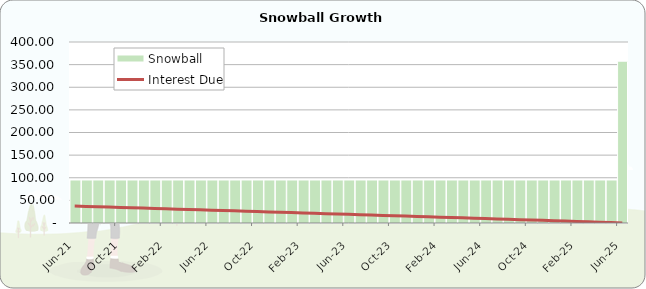
| Category | Snowball |
|---|---|
| 2021-06-01 | 95.03 |
| 2021-07-01 | 95.03 |
| 2021-08-01 | 95.03 |
| 2021-09-01 | 95.03 |
| 2021-10-01 | 95.03 |
| 2021-11-01 | 95.03 |
| 2021-12-01 | 95.03 |
| 2022-01-01 | 95.03 |
| 2022-02-01 | 95.03 |
| 2022-03-01 | 95.03 |
| 2022-04-01 | 95.03 |
| 2022-05-01 | 95.03 |
| 2022-06-01 | 95.03 |
| 2022-07-01 | 95.03 |
| 2022-08-01 | 95.03 |
| 2022-09-01 | 95.03 |
| 2022-10-01 | 95.03 |
| 2022-11-01 | 95.03 |
| 2022-12-01 | 95.03 |
| 2023-01-01 | 95.03 |
| 2023-02-01 | 95.03 |
| 2023-03-01 | 95.03 |
| 2023-04-01 | 95.03 |
| 2023-05-01 | 95.03 |
| 2023-06-01 | 95.03 |
| 2023-07-01 | 95.03 |
| 2023-08-01 | 95.03 |
| 2023-09-01 | 95.03 |
| 2023-10-01 | 95.03 |
| 2023-11-01 | 95.03 |
| 2023-12-01 | 95.03 |
| 2024-01-01 | 95.03 |
| 2024-02-01 | 95.03 |
| 2024-03-01 | 95.03 |
| 2024-04-01 | 95.03 |
| 2024-05-01 | 95.03 |
| 2024-06-01 | 95.03 |
| 2024-07-01 | 95.03 |
| 2024-08-01 | 95.03 |
| 2024-09-01 | 95.03 |
| 2024-10-01 | 95.03 |
| 2024-11-01 | 95.03 |
| 2024-12-01 | 95.03 |
| 2025-01-01 | 95.03 |
| 2025-02-01 | 95.03 |
| 2025-03-01 | 95.03 |
| 2025-04-01 | 95.03 |
| 2025-05-01 | 95.03 |
| 2025-06-01 | 357.56 |
| #N/A | 0 |
| #N/A | 0 |
| #N/A | 0 |
| #N/A | 0 |
| #N/A | 0 |
| #N/A | 0 |
| #N/A | 0 |
| #N/A | 0 |
| #N/A | 0 |
| #N/A | 0 |
| #N/A | 0 |
| #N/A | 0 |
| #N/A | 0 |
| #N/A | 0 |
| #N/A | 0 |
| #N/A | 0 |
| #N/A | 0 |
| #N/A | 0 |
| #N/A | 0 |
| #N/A | 0 |
| #N/A | 0 |
| #N/A | 0 |
| #N/A | 0 |
| #N/A | 0 |
| #N/A | 0 |
| #N/A | 0 |
| #N/A | 0 |
| #N/A | 0 |
| #N/A | 0 |
| #N/A | 0 |
| #N/A | 0 |
| #N/A | 0 |
| #N/A | 0 |
| #N/A | 0 |
| #N/A | 0 |
| #N/A | 0 |
| #N/A | 0 |
| #N/A | 0 |
| #N/A | 0 |
| #N/A | 0 |
| #N/A | 0 |
| #N/A | 0 |
| #N/A | 0 |
| #N/A | 0 |
| #N/A | 0 |
| #N/A | 0 |
| #N/A | 0 |
| #N/A | 0 |
| #N/A | 0 |
| #N/A | 0 |
| #N/A | 0 |
| #N/A | 0 |
| #N/A | 0 |
| #N/A | 0 |
| #N/A | 0 |
| #N/A | 0 |
| #N/A | 0 |
| #N/A | 0 |
| #N/A | 0 |
| #N/A | 0 |
| #N/A | 0 |
| #N/A | 0 |
| #N/A | 0 |
| #N/A | 0 |
| #N/A | 0 |
| #N/A | 0 |
| #N/A | 0 |
| #N/A | 0 |
| #N/A | 0 |
| #N/A | 0 |
| #N/A | 0 |
| #N/A | 0 |
| #N/A | 0 |
| #N/A | 0 |
| #N/A | 0 |
| #N/A | 0 |
| #N/A | 0 |
| #N/A | 0 |
| #N/A | 0 |
| #N/A | 0 |
| #N/A | 0 |
| #N/A | 0 |
| #N/A | 0 |
| #N/A | 0 |
| #N/A | 0 |
| #N/A | 0 |
| #N/A | 0 |
| #N/A | 0 |
| #N/A | 0 |
| #N/A | 0 |
| #N/A | 0 |
| #N/A | 0 |
| #N/A | 0 |
| #N/A | 0 |
| #N/A | 0 |
| #N/A | 0 |
| #N/A | 0 |
| #N/A | 0 |
| #N/A | 0 |
| #N/A | 0 |
| #N/A | 0 |
| #N/A | 0 |
| #N/A | 0 |
| #N/A | 0 |
| #N/A | 0 |
| #N/A | 0 |
| #N/A | 0 |
| #N/A | 0 |
| #N/A | 0 |
| #N/A | 0 |
| #N/A | 0 |
| #N/A | 0 |
| #N/A | 0 |
| #N/A | 0 |
| #N/A | 0 |
| #N/A | 0 |
| #N/A | 0 |
| #N/A | 0 |
| #N/A | 0 |
| #N/A | 0 |
| #N/A | 0 |
| #N/A | 0 |
| #N/A | 0 |
| #N/A | 0 |
| #N/A | 0 |
| #N/A | 0 |
| #N/A | 0 |
| #N/A | 0 |
| #N/A | 0 |
| #N/A | 0 |
| #N/A | 0 |
| #N/A | 0 |
| #N/A | 0 |
| #N/A | 0 |
| #N/A | 0 |
| #N/A | 0 |
| #N/A | 0 |
| #N/A | 0 |
| #N/A | 0 |
| #N/A | 0 |
| #N/A | 0 |
| #N/A | 0 |
| #N/A | 0 |
| #N/A | 0 |
| #N/A | 0 |
| #N/A | 0 |
| #N/A | 0 |
| #N/A | 0 |
| #N/A | 0 |
| #N/A | 0 |
| #N/A | 0 |
| #N/A | 0 |
| #N/A | 0 |
| #N/A | 0 |
| #N/A | 0 |
| #N/A | 0 |
| #N/A | 0 |
| #N/A | 0 |
| #N/A | 0 |
| #N/A | 0 |
| #N/A | 0 |
| #N/A | 0 |
| #N/A | 0 |
| #N/A | 0 |
| #N/A | 0 |
| #N/A | 0 |
| #N/A | 0 |
| #N/A | 0 |
| #N/A | 0 |
| #N/A | 0 |
| #N/A | 0 |
| #N/A | 0 |
| #N/A | 0 |
| #N/A | 0 |
| #N/A | 0 |
| #N/A | 0 |
| #N/A | 0 |
| #N/A | 0 |
| #N/A | 0 |
| #N/A | 0 |
| #N/A | 0 |
| #N/A | 0 |
| #N/A | 0 |
| #N/A | 0 |
| #N/A | 0 |
| #N/A | 0 |
| #N/A | 0 |
| #N/A | 0 |
| #N/A | 0 |
| #N/A | 0 |
| #N/A | 0 |
| #N/A | 0 |
| #N/A | 0 |
| #N/A | 0 |
| #N/A | 0 |
| #N/A | 0 |
| #N/A | 0 |
| #N/A | 0 |
| #N/A | 0 |
| #N/A | 0 |
| #N/A | 0 |
| #N/A | 0 |
| #N/A | 0 |
| #N/A | 0 |
| #N/A | 0 |
| #N/A | 0 |
| #N/A | 0 |
| #N/A | 0 |
| #N/A | 0 |
| #N/A | 0 |
| #N/A | 0 |
| #N/A | 0 |
| #N/A | 0 |
| #N/A | 0 |
| #N/A | 0 |
| #N/A | 0 |
| #N/A | 0 |
| #N/A | 0 |
| #N/A | 0 |
| #N/A | 0 |
| #N/A | 0 |
| #N/A | 0 |
| #N/A | 0 |
| #N/A | 0 |
| #N/A | 0 |
| #N/A | 0 |
| #N/A | 0 |
| #N/A | 0 |
| #N/A | 0 |
| #N/A | 0 |
| #N/A | 0 |
| #N/A | 0 |
| #N/A | 0 |
| #N/A | 0 |
| #N/A | 0 |
| #N/A | 0 |
| #N/A | 0 |
| #N/A | 0 |
| #N/A | 0 |
| #N/A | 0 |
| #N/A | 0 |
| #N/A | 0 |
| #N/A | 0 |
| #N/A | 0 |
| #N/A | 0 |
| #N/A | 0 |
| #N/A | 0 |
| #N/A | 0 |
| #N/A | 0 |
| #N/A | 0 |
| #N/A | 0 |
| #N/A | 0 |
| #N/A | 0 |
| #N/A | 0 |
| #N/A | 0 |
| #N/A | 0 |
| #N/A | 0 |
| #N/A | 0 |
| #N/A | 0 |
| #N/A | 0 |
| #N/A | 0 |
| #N/A | 0 |
| #N/A | 0 |
| #N/A | 0 |
| #N/A | 0 |
| #N/A | 0 |
| #N/A | 0 |
| #N/A | 0 |
| #N/A | 0 |
| #N/A | 0 |
| #N/A | 0 |
| #N/A | 0 |
| #N/A | 0 |
| #N/A | 0 |
| #N/A | 0 |
| #N/A | 0 |
| #N/A | 0 |
| #N/A | 0 |
| #N/A | 0 |
| #N/A | 0 |
| #N/A | 0 |
| #N/A | 0 |
| #N/A | 0 |
| #N/A | 0 |
| #N/A | 0 |
| #N/A | 0 |
| #N/A | 0 |
| #N/A | 0 |
| #N/A | 0 |
| #N/A | 0 |
| #N/A | 0 |
| #N/A | 0 |
| #N/A | 0 |
| #N/A | 0 |
| #N/A | 0 |
| #N/A | 0 |
| #N/A | 0 |
| #N/A | 0 |
| #N/A | 0 |
| #N/A | 0 |
| #N/A | 0 |
| #N/A | 0 |
| #N/A | 0 |
| #N/A | 0 |
| #N/A | 0 |
| #N/A | 0 |
| #N/A | 0 |
| #N/A | 0 |
| #N/A | 0 |
| #N/A | 0 |
| #N/A | 0 |